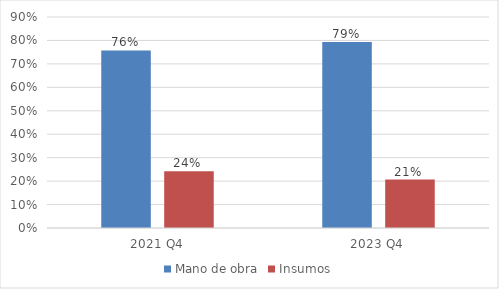
| Category | Mano de obra | Insumos |
|---|---|---|
| 2021 Q4 | 0.758 | 0.242 |
| 2023 Q4 | 0.793 | 0.207 |